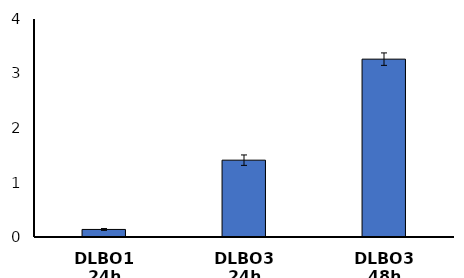
| Category | Butyl Octanoate |
|---|---|
| DLBO1 24h | 0.139 |
| DLBO3 24h | 1.41 |
| DLBO3 48h | 3.263 |